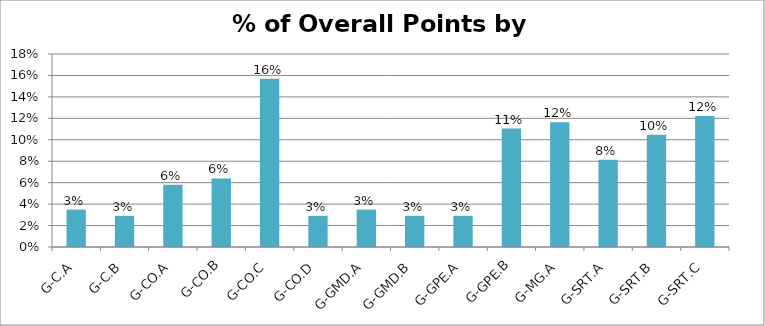
| Category | % of Points |
|---|---|
| G-C.A | 0.035 |
| G-C.B | 0.029 |
| G-CO.A | 0.058 |
| G-CO.B | 0.064 |
| G-CO.C | 0.157 |
| G-CO.D | 0.029 |
| G-GMD.A | 0.035 |
| G-GMD.B | 0.029 |
| G-GPE.A | 0.029 |
| G-GPE.B | 0.11 |
| G-MG.A | 0.116 |
| G-SRT.A | 0.081 |
| G-SRT.B | 0.105 |
| G-SRT.C | 0.122 |